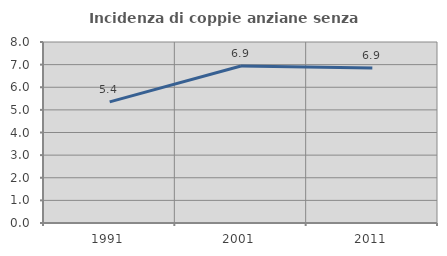
| Category | Incidenza di coppie anziane senza figli  |
|---|---|
| 1991.0 | 5.355 |
| 2001.0 | 6.94 |
| 2011.0 | 6.855 |